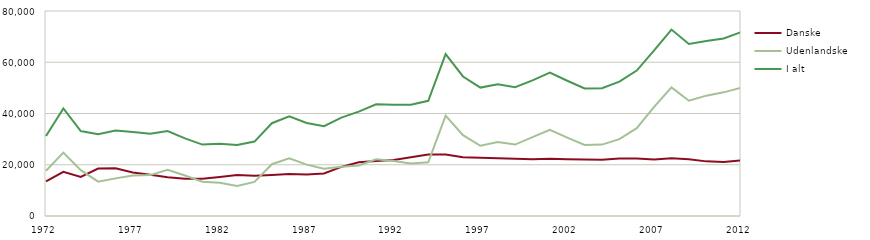
| Category | Danske | Udenlandske | I alt |
|---|---|---|---|
| 1972 | 13520 | 17680 | 31200 |
| 1973 | 17219 | 24729 | 41948 |
| 1974 | 15237 | 17909 | 33146 |
| 1975 | 18528 | 13418 | 31946 |
| 1976 | 18632 | 14688 | 33320 |
| 1977 | 16977 | 15763 | 32740 |
| 1978 | 16098 | 15961 | 32059 |
| 1979 | 15134 | 18049 | 33183 |
| 1980 | 14526 | 15785 | 30311 |
| 1981 | 14513 | 13361 | 27874 |
| 1982 | 15255 | 12968 | 28223 |
| 1983 | 15958 | 11760 | 27718 |
| 1984 | 15742 | 13293 | 29035 |
| 1985 | 16013 | 20201 | 36214 |
| 1986 | 16389 | 22543 | 38932 |
| 1987 | 16239 | 20057 | 36296 |
| 1988 | 16605 | 18446 | 35051 |
| 1989 | 19180 | 19211 | 38391 |
| 1990 | 21000 | 19715 | 40715 |
| 1991 | 21445 | 22122 | 43567 |
| 1992 | 21893 | 21484 | 43377 |
| 1993 | 22921 | 20479 | 43400 |
| 1994 | 23984 | 20977 | 44961 |
| 1995 | 24042 | 39145 | 63187 |
| 1996 | 22918 | 31527 | 54445 |
| 1997 | 22694 | 27411 | 50105 |
| 1998 | 22542 | 28830 | 51372 |
| 1999 | 22353 | 27883 | 50236 |
| 2000 | 22105 | 30810 | 52915 |
| 2001 | 22330 | 33654 | 55984 |
| 2002 | 22181 | 30597 | 52778 |
| 2003 | 22062 | 27692 | 49754 |
| 2004 | 21990 | 27870 | 49860 |
| 2005 | 22469 | 29989 | 52458 |
| 2006 | 22469 | 34281 | 56750 |
| 2007 | 22033 | 42623 | 64656 |
| 2008 | 22553 | 50196 | 72749 |
| 2009 | 22184 | 44977 | 67161 |
| 2010 | 21319 | 46963 | 68282 |
| 2011 | 21047 | 48251 | 69298 |
| 2012 | 21675 | 50064 | 71739 |